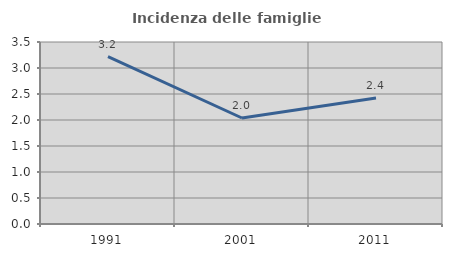
| Category | Incidenza delle famiglie numerose |
|---|---|
| 1991.0 | 3.218 |
| 2001.0 | 2.038 |
| 2011.0 | 2.424 |